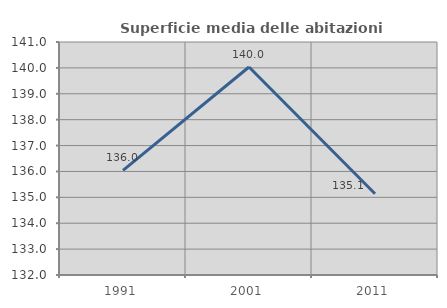
| Category | Superficie media delle abitazioni occupate |
|---|---|
| 1991.0 | 136.042 |
| 2001.0 | 140.033 |
| 2011.0 | 135.14 |